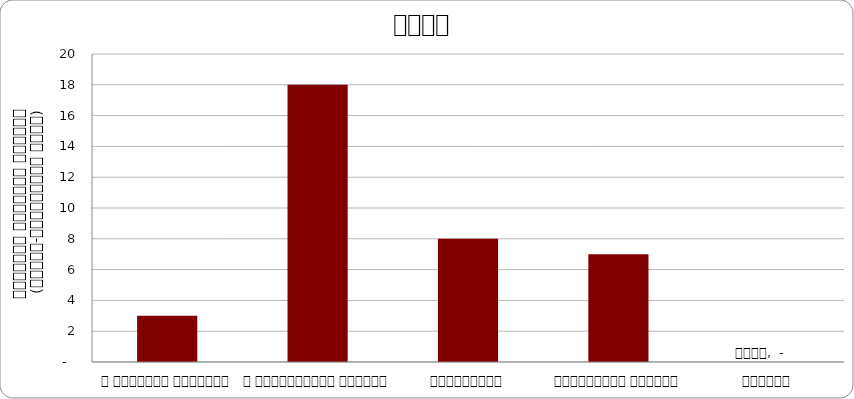
| Category | अन्य |
|---|---|
| द हिमालयन टाइम्स् | 3 |
| द काठमाण्डौं पोस्ट् | 18 |
| कान्तिपुर | 8 |
| अन्नपूर्ण पोस्ट् | 7 |
| नागरिक | 0 |